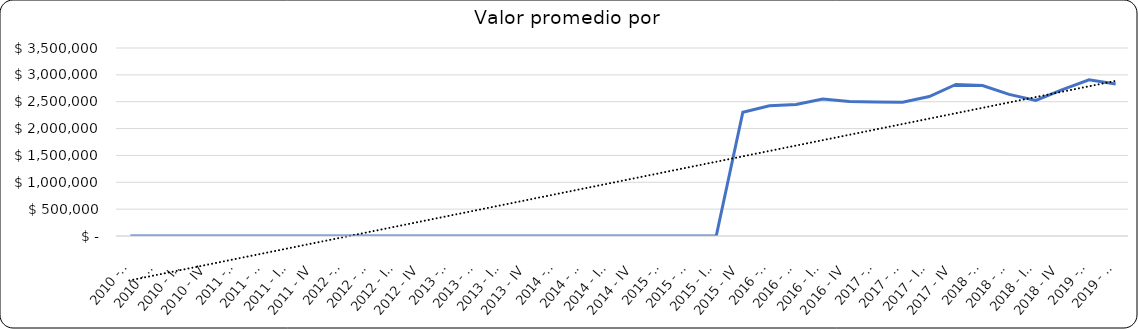
| Category | Valor m2 en Bogotá por sectores |
|---|---|
| 2010 - I | 0 |
| 2010 - II | 0 |
| 2010 - III | 0 |
| 2010 - IV | 0 |
| 2011 - I | 0 |
| 2011 - II | 0 |
| 2011 - III | 0 |
| 2011 - IV | 0 |
| 2012 - I | 0 |
| 2012 - II | 0 |
| 2012 - III | 0 |
| 2012 - IV | 0 |
| 2013 - I | 0 |
| 2013 - II | 0 |
| 2013 - III | 0 |
| 2013 - IV | 0 |
| 2014 - I | 0 |
| 2014 - II | 0 |
| 2014 - III | 0 |
| 2014 - IV | 0 |
| 2015 - I | 0 |
| 2015 - II | 0 |
| 2015 - III | 0 |
| 2015 - IV | 2303030.303 |
| 2016 - I | 2424242.424 |
| 2016 - II | 2449404.762 |
| 2016 - III | 2548484.848 |
| 2016 - IV | 2505952.381 |
| 2017 - I | 2496969.697 |
| 2017 - II | 2490606.091 |
| 2017 - III | 2596385.542 |
| 2017 - IV | 2821875 |
| 2018 - I | 2800000 |
| 2018 - II | 2636363.636 |
| 2018 - III | 2523364 |
| 2018 - IV | 2725425 |
| 2019 - I | 2909091 |
| 2019 - II | 2830189 |